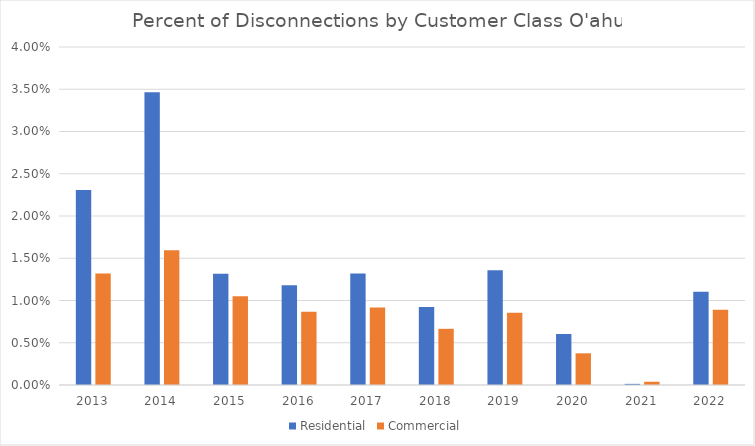
| Category | Residential | Commercial |
|---|---|---|
| 2013.0 | 0.023 | 0.013 |
| 2014.0 | 0.035 | 0.016 |
| 2015.0 | 0.013 | 0.011 |
| 2016.0 | 0.012 | 0.009 |
| 2017.0 | 0.013 | 0.009 |
| 2018.0 | 0.009 | 0.007 |
| 2019.0 | 0.014 | 0.009 |
| 2020.0 | 0.006 | 0.004 |
| 2021.0 | 0 | 0 |
| 2022.0 | 0.011 | 0.009 |